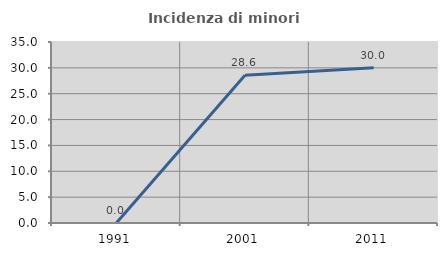
| Category | Incidenza di minori stranieri |
|---|---|
| 1991.0 | 0 |
| 2001.0 | 28.571 |
| 2011.0 | 30 |